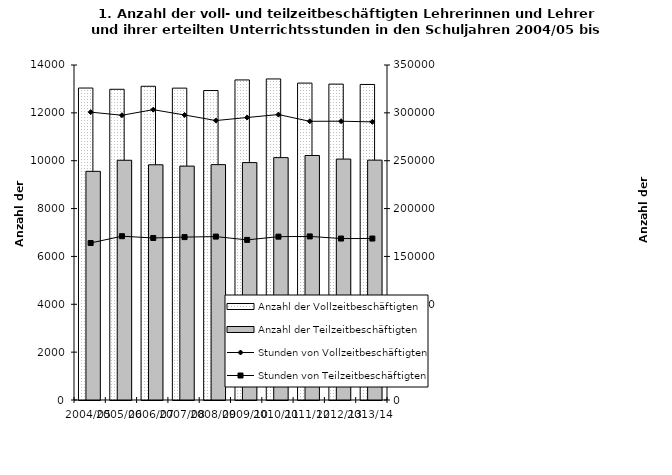
| Category | Anzahl der Vollzeitbeschäftigten | Anzahl der Teilzeitbeschäftigten |
|---|---|---|
| 2004/05 | 13037 | 9556 |
| 2005/06 | 12985 | 10019 |
| 2006/07 | 13111 | 9830 |
| 2007/08 | 13033 | 9774 |
| 2008/09 | 12933 | 9836 |
| 2009/10 | 13376 | 9922 |
| 2010/11 | 13417 | 10129 |
| 2011/12 | 13244 | 10218 |
| 2012/13 | 13201 | 10069 |
| 2013/14 | 13187 | 10024 |